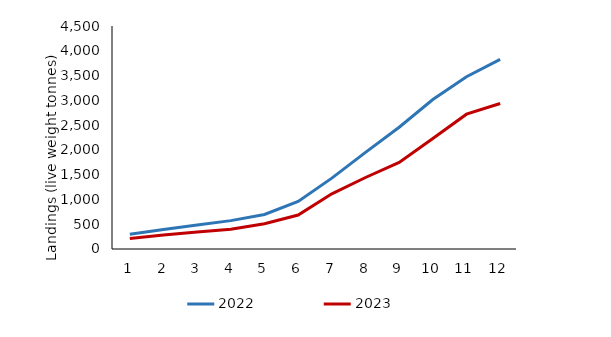
| Category | 2022 | 2023 |
|---|---|---|
| 0 | 295.951 | 213.246 |
| 1 | 394.311 | 280.847 |
| 2 | 486.348 | 343.848 |
| 3 | 572.824 | 398.173 |
| 4 | 697.393 | 511.338 |
| 5 | 959.382 | 684.695 |
| 6 | 1430.067 | 1113.29 |
| 7 | 1950.804 | 1442.734 |
| 8 | 2456.551 | 1745.87 |
| 9 | 3015.323 | 2229.268 |
| 10 | 3477.367 | 2720.852 |
| 11 | 3826.524 | 2936.418 |